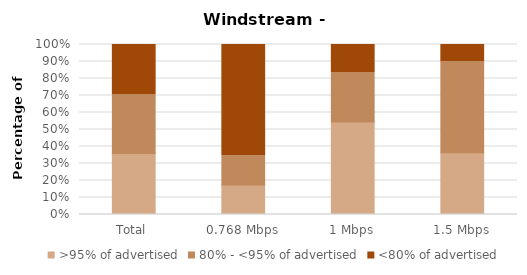
| Category | >95% of advertised | 80% - <95% of advertised | <80% of advertised |
|---|---|---|---|
| Total | 0.359 | 0.347 | 0.293 |
| 0.768 Mbps | 0.173 | 0.173 | 0.654 |
| 1 Mbps | 0.544 | 0.291 | 0.165 |
| 1.5 Mbps | 0.364 | 0.535 | 0.101 |